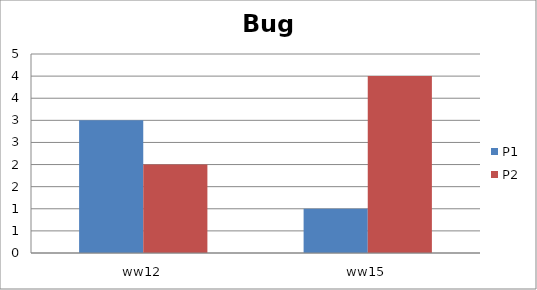
| Category | P1 | P2 |
|---|---|---|
| ww12 | 3 | 2 |
| ww15 | 1 | 4 |